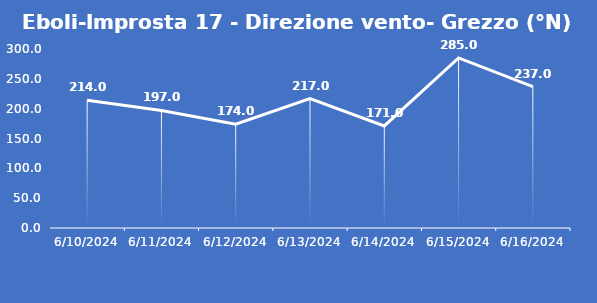
| Category | Eboli-Improsta 17 - Direzione vento- Grezzo (°N) |
|---|---|
| 6/10/24 | 214 |
| 6/11/24 | 197 |
| 6/12/24 | 174 |
| 6/13/24 | 217 |
| 6/14/24 | 171 |
| 6/15/24 | 285 |
| 6/16/24 | 237 |